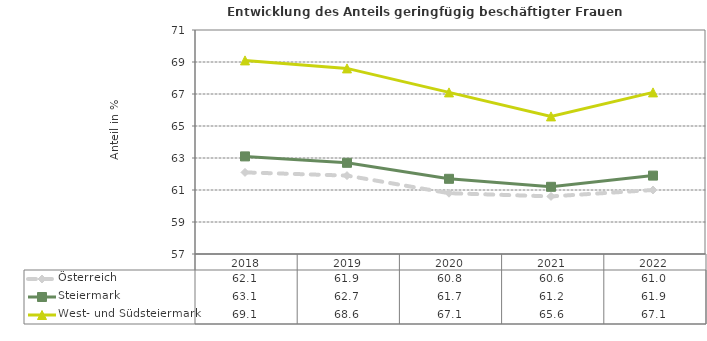
| Category | Österreich | Steiermark | West- und Südsteiermark |
|---|---|---|---|
| 2022.0 | 61 | 61.9 | 67.1 |
| 2021.0 | 60.6 | 61.2 | 65.6 |
| 2020.0 | 60.8 | 61.7 | 67.1 |
| 2019.0 | 61.9 | 62.7 | 68.6 |
| 2018.0 | 62.1 | 63.1 | 69.1 |